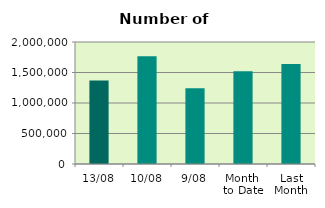
| Category | Series 0 |
|---|---|
| 13/08 | 1370124 |
| 10/08 | 1764490 |
| 9/08 | 1243366 |
| Month 
to Date | 1520421.111 |
| Last
Month | 1640369.455 |